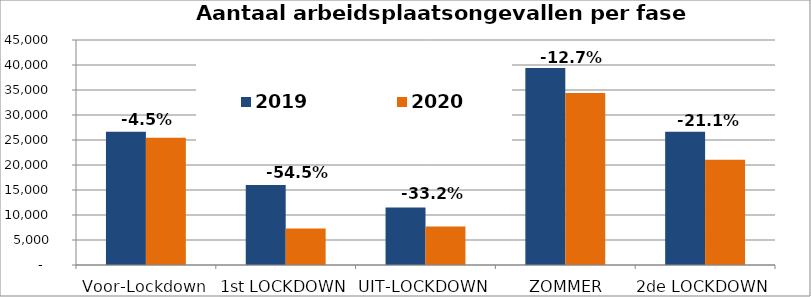
| Category | 2019 | 2020 |
|---|---|---|
| Voor-Lockdown | 26632 | 25442 |
| 1st LOCKDOWN | 16019 | 7287 |
| UIT-LOCKDOWN | 11505 | 7683 |
| ZOMMER PERIODE | 39380 | 34393 |
| 2de LOCKDOWN | 26666 | 21044 |